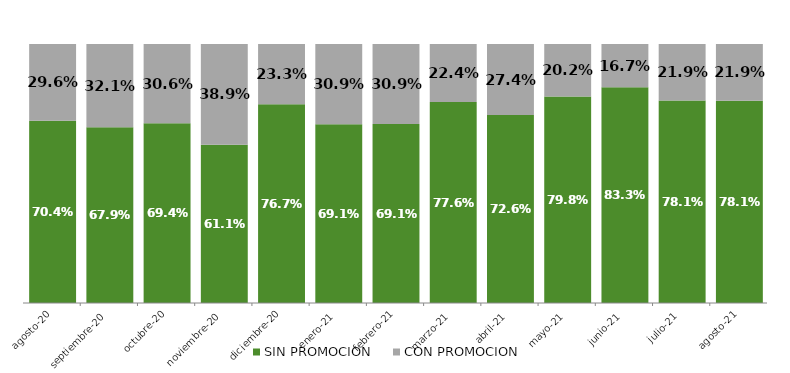
| Category | SIN PROMOCION   | CON PROMOCION   |
|---|---|---|
| 2020-08-01 | 0.704 | 0.296 |
| 2020-09-01 | 0.679 | 0.321 |
| 2020-10-01 | 0.694 | 0.306 |
| 2020-11-01 | 0.611 | 0.389 |
| 2020-12-01 | 0.767 | 0.233 |
| 2021-01-01 | 0.691 | 0.309 |
| 2021-02-01 | 0.691 | 0.309 |
| 2021-03-01 | 0.776 | 0.224 |
| 2021-04-01 | 0.726 | 0.274 |
| 2021-05-01 | 0.798 | 0.202 |
| 2021-06-01 | 0.833 | 0.167 |
| 2021-07-01 | 0.781 | 0.219 |
| 2021-08-01 | 0.781 | 0.219 |